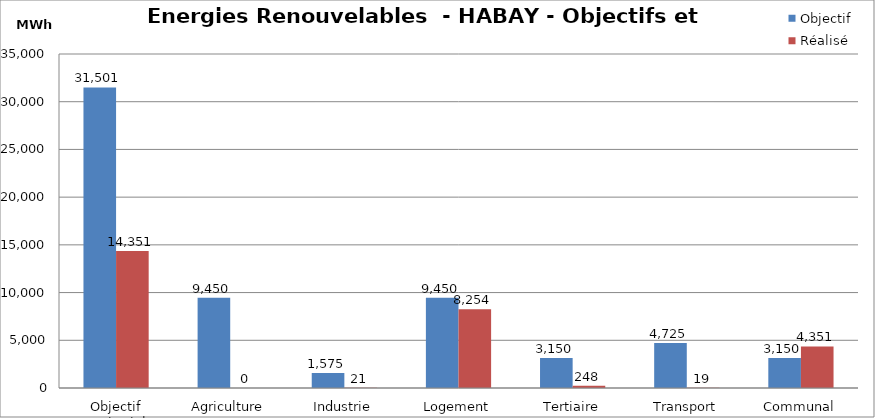
| Category | Objectif | Réalisé |
|---|---|---|
| Objectif territorial | 31501.109 | 14351.172 |
| Agriculture | 9450.333 | 0 |
| Industrie | 1575.055 | 20.936 |
| Logement | 9450.333 | 8254.008 |
| Tertiaire | 3150.111 | 247.95 |
| Transport | 4725.166 | 19.158 |
| Communal | 3150.111 | 4351.318 |